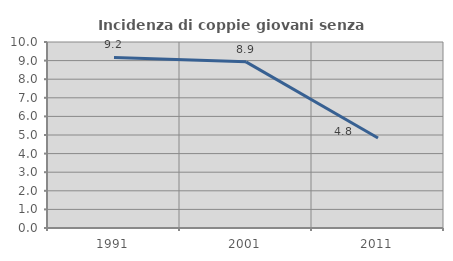
| Category | Incidenza di coppie giovani senza figli |
|---|---|
| 1991.0 | 9.172 |
| 2001.0 | 8.932 |
| 2011.0 | 4.836 |